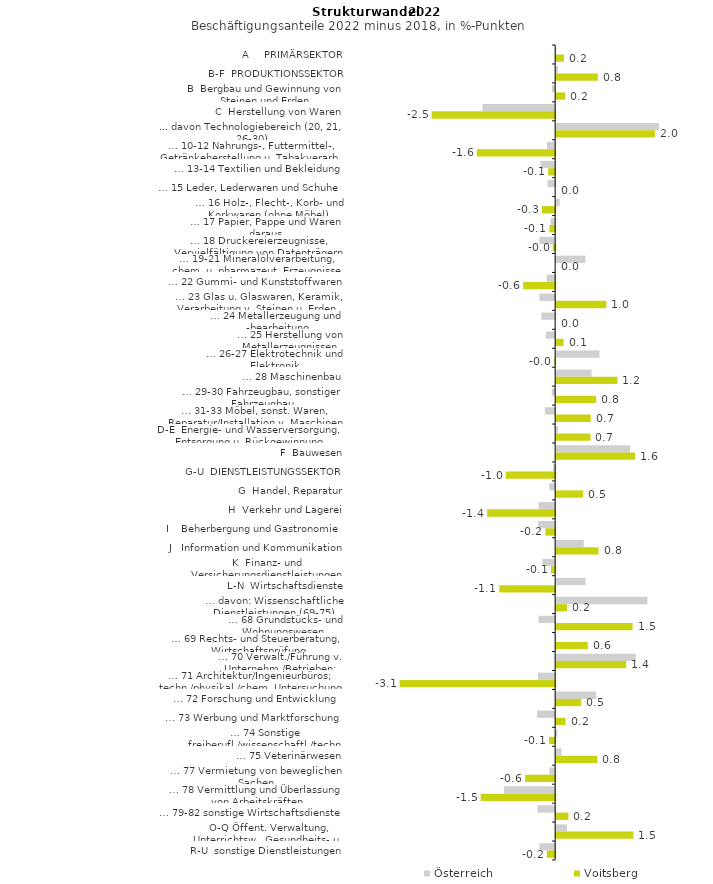
| Category | Österreich | Voitsberg |
|---|---|---|
| A     PRIMÄRSEKTOR | 0.004 | 0.153 |
| B-F  PRODUKTIONSSEKTOR | 0.036 | 0.83 |
| B  Bergbau und Gewinnung von Steinen und Erden | -0.063 | 0.182 |
| C  Herstellung von Waren | -1.445 | -2.456 |
| ... davon Technologiebereich (20, 21, 26-30) | 2.047 | 1.964 |
| … 10-12 Nahrungs-, Futtermittel-, Getränkeherstellung u. Tabakverarb. | -0.163 | -1.558 |
| … 13-14 Textilien und Bekleidung | -0.292 | -0.138 |
| … 15 Leder, Lederwaren und Schuhe | -0.15 | 0 |
| … 16 Holz-, Flecht-, Korb- und Korkwaren (ohne Möbel)  | 0.068 | -0.264 |
| … 17 Papier, Pappe und Waren daraus  | -0.09 | -0.116 |
| … 18 Druckereierzeugnisse, Vervielfältigung von Datenträgern | -0.314 | -0.048 |
| … 19-21 Mineralölverarbeitung, chem. u. pharmazeut. Erzeugnisse | 0.584 | 0 |
| … 22 Gummi- und Kunststoffwaren | -0.168 | -0.637 |
| … 23 Glas u. Glaswaren, Keramik, Verarbeitung v. Steinen u. Erden  | -0.312 | 0.997 |
| … 24 Metallerzeugung und -bearbeitung | -0.276 | 0 |
| … 25 Herstellung von Metallerzeugnissen  | -0.185 | 0.149 |
| … 26-27 Elektrotechnik und Elektronik | 0.862 | -0.017 |
| … 28 Maschinenbau | 0.705 | 1.219 |
| … 29-30 Fahrzeugbau, sonstiger Fahrzeugbau | -0.066 | 0.795 |
| … 31-33 Möbel, sonst. Waren, Reparatur/Installation v. Maschinen | -0.204 | 0.688 |
| D-E  Energie- und Wasserversorgung, Entsorgung u. Rückgewinnung | 0.038 | 0.683 |
| F  Bauwesen | 1.469 | 1.57 |
| G-U  DIENSTLEISTUNGSSEKTOR | -0.04 | -0.983 |
| G  Handel, Reparatur | -0.115 | 0.539 |
| H  Verkehr und Lagerei | -0.33 | -1.353 |
| I    Beherbergung und Gastronomie | -0.34 | -0.195 |
| J   Information und Kommunikation | 0.551 | 0.843 |
| K  Finanz- und Versicherungsdienstleistungen | -0.255 | -0.082 |
| L-N  Wirtschaftsdienste | 0.586 | -1.112 |
| … davon: Wissenschaftliche Dienstleistungen (69-75) | 1.815 | 0.219 |
| … 68 Grundstücks- und Wohnungswesen  | -0.331 | 1.519 |
| … 69 Rechts- und Steuerberatung, Wirtschaftsprüfung | 0.008 | 0.628 |
| … 70 Verwalt./Führung v. Unternehm./Betrieben; Unternehmensberat. | 1.583 | 1.393 |
| … 71 Architektur/Ingenieurbüros; techn./physikal./chem. Untersuchung | -0.344 | -3.094 |
| … 72 Forschung und Entwicklung  | 0.797 | 0.5 |
| … 73 Werbung und Marktforschung | -0.361 | 0.188 |
| … 74 Sonstige freiberufl./wissenschaftl./techn. Tätigkeiten | 0.025 | -0.122 |
| … 75 Veterinärwesen | 0.108 | 0.82 |
| … 77 Vermietung von beweglichen Sachen  | -0.116 | -0.598 |
| … 78 Vermittlung und Überlassung von Arbeitskräften | -1.018 | -1.48 |
| … 79-82 sonstige Wirtschaftsdienste | -0.351 | 0.245 |
| O-Q Öffent. Verwaltung, Unterrichtsw., Gesundheits- u. Sozialwesen | 0.216 | 1.538 |
| R-U  sonstige Dienstleistungen | -0.314 | -0.166 |